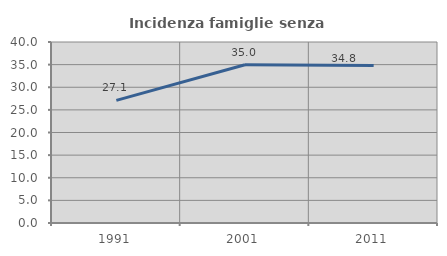
| Category | Incidenza famiglie senza nuclei |
|---|---|
| 1991.0 | 27.106 |
| 2001.0 | 34.967 |
| 2011.0 | 34.783 |